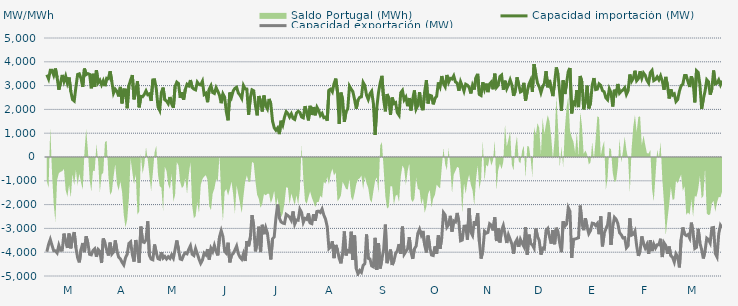
| Category | Capacidad importación (MW) | Capacidad exportación (MW) |
|---|---|---|
| 0 | 3457.333 | -3980.625 |
| 1900-01-01 | 3283.042 | -3676.875 |
| 1900-01-02 | 3641.25 | -3464.5 |
| 1900-01-03 | 3640.708 | -3708.75 |
| 1900-01-04 | 3435.708 | -3937.5 |
| 1900-01-05 | 3718.125 | -3943.125 |
| 1900-01-06 | 3344.458 | -4031.25 |
| 1900-01-07 | 2827.083 | -3710.625 |
| 1900-01-08 | 3113.75 | -3920.625 |
| 1900-01-09 | 3448.125 | -3913.125 |
| 1900-01-10 | 3172.083 | -3219.375 |
| 1900-01-11 | 3397.5 | -3562.5 |
| 1900-01-12 | 3101.042 | -3819.375 |
| 1900-01-13 | 3341.25 | -3215.625 |
| 1900-01-14 | 2760.833 | -3838.125 |
| 1900-01-15 | 2417.5 | -3395.625 |
| 1900-01-16 | 2354.583 | -3155.625 |
| 1900-01-17 | 2936.875 | -3811.875 |
| 1900-01-18 | 3468.75 | -4241.25 |
| 1900-01-19 | 3495 | -4426.875 |
| 1900-01-20 | 3297.083 | -3890.625 |
| 1900-01-21 | 2946.292 | -3613.125 |
| 1900-01-22 | 3714.792 | -3997.5 |
| 1900-01-23 | 3460.833 | -3331.875 |
| 1900-01-24 | 3502.917 | -3618.5 |
| 1900-01-25 | 3472.5 | -4089.375 |
| 1900-01-26 | 2885.87 | -4111.304 |
| 1900-01-27 | 3496.875 | -3930 |
| 1900-01-28 | 2942.5 | -3858.75 |
| 1900-01-29 | 3650.625 | -4194.375 |
| 1900-01-30 | 3122.458 | -3885 |
| 1900-01-31 | 3230.042 | -3961.875 |
| 1900-02-01 | 3034.208 | -4453.125 |
| 1900-02-02 | 3206.25 | -3423.75 |
| 1900-02-03 | 2977.5 | -3611.25 |
| 1900-02-04 | 3309.375 | -3911.25 |
| 1900-02-05 | 3288.75 | -4138.125 |
| 1900-02-06 | 3602.833 | -3596.25 |
| 1900-02-07 | 3174.375 | -4080 |
| 1900-02-08 | 2683.667 | -3991.875 |
| 1900-02-09 | 2848.875 | -3504.833 |
| 1900-02-10 | 2758.542 | -3938.333 |
| 1900-02-11 | 2545.417 | -4209.375 |
| 1900-02-12 | 2945.625 | -4278.75 |
| 1900-02-13 | 2252.5 | -4423.125 |
| 1900-02-14 | 2829.375 | -4533.75 |
| 1900-02-15 | 2820.917 | -4235.625 |
| 1900-02-16 | 2048.125 | -4081.208 |
| 1900-02-17 | 3003.75 | -3632.292 |
| 1900-02-18 | 3232.5 | -3565.625 |
| 1900-02-19 | 3440.625 | -4096.875 |
| 1900-02-20 | 2422.5 | -4393.125 |
| 1900-02-21 | 2763.958 | -3487.5 |
| 1900-02-22 | 3183.75 | -3943.125 |
| 1900-02-23 | 2087.083 | -4443.75 |
| 1900-02-24 | 2547 | -2925.75 |
| 1900-02-25 | 2531.667 | -3560.625 |
| 1900-02-26 | 2628.75 | -3590.625 |
| 1900-02-27 | 2778.75 | -3480 |
| 1900-02-28 | 2617.292 | -2701.792 |
| 1900-02-28 | 2655 | -4141.875 |
| 1900-03-01 | 2355.417 | -4288.125 |
| 1900-03-02 | 3240.75 | -4318.125 |
| 1900-03-03 | 3247.5 | -3676.875 |
| 1900-03-04 | 2878.042 | -4025.625 |
| 1900-03-05 | 2109.167 | -4269.375 |
| 1900-03-06 | 1961.042 | -4299.375 |
| 1900-03-07 | 2710.208 | -4003.125 |
| 1900-03-08 | 2916 | -4248.333 |
| 1900-03-09 | 2401.875 | -4179.375 |
| 1900-03-10 | 2351.25 | -4286.25 |
| 1900-03-11 | 2238.75 | -4192.5 |
| 1900-03-12 | 2520 | -4265.625 |
| 1900-03-13 | 2227.5 | -4108.125 |
| 1900-03-14 | 2070.583 | -4246.875 |
| 1900-03-15 | 2958.75 | -3892.5 |
| 1900-03-16 | 3146.25 | -3508.125 |
| 1900-03-17 | 3087.5 | -3877.5 |
| 1900-03-18 | 2487.5 | -4284.375 |
| 1900-03-19 | 2722.5 | -4310.625 |
| 1900-03-20 | 2411.25 | -4125 |
| 1900-03-21 | 2840.5 | -4025.625 |
| 1900-03-22 | 3054.5 | -4066.875 |
| 1900-03-23 | 2992.958 | -3879.375 |
| 1900-03-24 | 3232.5 | -3729.375 |
| 1900-03-25 | 2917.5 | -4085.625 |
| 1900-03-26 | 2853.75 | -4141.875 |
| 1900-03-27 | 2819.458 | -3849.375 |
| 1900-03-28 | 3145.042 | -4061.25 |
| 1900-03-29 | 3046.958 | -4290 |
| 1900-03-30 | 3028.125 | -4468.125 |
| 1900-03-31 | 3180.542 | -4331.25 |
| 1900-04-01 | 2624.958 | -4042.5 |
| 1900-04-02 | 2676.25 | -4115.625 |
| 1900-04-03 | 2302.5 | -3873.75 |
| 1900-04-04 | 2854.208 | -4308.75 |
| 1900-04-05 | 2997.833 | -3837.167 |
| 1900-04-06 | 2709.375 | -3973.125 |
| 1900-04-07 | 2670 | -3712.958 |
| 1900-04-08 | 2913.75 | -3958.125 |
| 1900-04-09 | 2765.625 | -4134.375 |
| 1900-04-10 | 2587.5 | -3352.5 |
| 1900-04-11 | 2261.25 | -3093.75 |
| 1900-04-12 | 2651.25 | -3345.208 |
| 1900-04-13 | 2510.625 | -3963.75 |
| 1900-04-14 | 1885.875 | -4044.375 |
| 1900-04-15 | 1541.5 | -3601.375 |
| 1900-04-16 | 2707.5 | -4426.875 |
| 1900-04-17 | 2516.25 | -4128.75 |
| 1900-04-18 | 2775 | -4059.375 |
| 1900-04-19 | 2883.75 | -3906.667 |
| 1900-04-20 | 2930.625 | -3742.5 |
| 1900-04-21 | 2685 | -4061.25 |
| 1900-04-22 | 2596.875 | -4213.125 |
| 1900-04-23 | 2463.75 | -4295.625 |
| 1900-04-24 | 3005.625 | -4065 |
| 1900-04-25 | 2861.25 | -4370.625 |
| 1900-04-26 | 2855.083 | -3533.583 |
| 1900-04-27 | 1775.625 | -3751.875 |
| 1900-04-28 | 2478.75 | -3391.875 |
| 1900-04-29 | 2821.875 | -2444.375 |
| 1900-04-30 | 2782.5 | -2903.75 |
| 1900-05-01 | 2169.375 | -3964.667 |
| 1900-05-02 | 1751.292 | -3614.625 |
| 1900-05-03 | 2561.25 | -2926.875 |
| 1900-05-04 | 2356.875 | -3995.625 |
| 1900-05-05 | 1911.125 | -2849.625 |
| 1900-05-06 | 2583.75 | -3240 |
| 1900-05-07 | 2157.125 | -2962.917 |
| 1900-05-08 | 2021.375 | -3195.625 |
| 1900-05-09 | 2439.375 | -3776.25 |
| 1900-05-10 | 2235 | -4305 |
| 1900-05-11 | 1509.375 | -3436.875 |
| 1900-05-12 | 1230.208 | -3360 |
| 1900-05-13 | 1123.125 | -2546.875 |
| 1900-05-14 | 1221.25 | -1995.875 |
| 1900-05-15 | 962.083 | -2563.125 |
| 1900-05-16 | 1523.958 | -2728.125 |
| 1900-05-17 | 1344.375 | -2776.875 |
| 1900-05-18 | 1676.25 | -2795.625 |
| 1900-05-19 | 1899.375 | -2411.25 |
| 1900-05-20 | 1826.25 | -2461.875 |
| 1900-05-21 | 1680 | -2529.375 |
| 1900-05-22 | 1815 | -2662.5 |
| 1900-05-23 | 1621.458 | -2287.5 |
| 1900-05-24 | 1577.083 | -2818.125 |
| 1900-05-25 | 1846.875 | -2643.75 |
| 1900-05-26 | 1923.75 | -2656.875 |
| 1900-05-27 | 1875 | -2195.625 |
| 1900-05-28 | 1683.75 | -2330.625 |
| 1900-05-29 | 1646.25 | -2746.875 |
| 1900-05-30 | 2137.5 | -2580.5 |
| 1900-05-31 | 1860 | -2620.625 |
| 1900-06-01 | 1537.5 | -2371.875 |
| 1900-06-02 | 2149.292 | -2771.25 |
| 1900-06-03 | 1766.25 | -2801.25 |
| 1900-06-04 | 2097.75 | -2405.625 |
| 1900-06-05 | 1753.125 | -2676.75 |
| 1900-06-06 | 2090.625 | -2285.292 |
| 1900-06-07 | 1956.125 | -2274.75 |
| 1900-06-08 | 1743.75 | -2330.125 |
| 1900-06-09 | 1833.75 | -2185.875 |
| 1900-06-10 | 1651.875 | -2439.375 |
| 1900-06-11 | 1677 | -2608.125 |
| 1900-06-12 | 1526.25 | -2926.875 |
| 1900-06-13 | 2806.875 | -3847.5 |
| 1900-06-14 | 2853.75 | -3770.625 |
| 1900-06-15 | 2739.375 | -3542.5 |
| 1900-06-16 | 3086.25 | -4248.75 |
| 1900-06-17 | 3294.375 | -3694.583 |
| 1900-06-18 | 2737.5 | -3914.167 |
| 1900-06-19 | 1388.958 | -4258.125 |
| 1900-06-20 | 2705.625 | -4468.125 |
| 1900-06-21 | 2414.25 | -4032.292 |
| 1900-06-22 | 1474.5 | -3127.5 |
| 1900-06-23 | 1904.833 | -4134.375 |
| 1900-06-24 | 2018.333 | -3933.75 |
| 1900-06-25 | 2978.625 | -3980.625 |
| 1900-06-26 | 2851.875 | -3137.917 |
| 1900-06-27 | 2745 | -4327.5 |
| 1900-06-28 | 2411.25 | -3294.375 |
| 1900-06-29 | 2032.5 | -4693.125 |
| 1900-06-30 | 2394.375 | -4916.25 |
| 1900-07-01 | 2506.875 | -4770 |
| 1900-07-02 | 2527.5 | -4845 |
| 1900-07-03 | 3132.875 | -4556.25 |
| 1900-07-04 | 3001.875 | -4479.375 |
| 1900-07-05 | 2597 | -3253.75 |
| 1900-07-06 | 2415.833 | -4258.125 |
| 1900-07-07 | 2655 | -4284.375 |
| 1900-07-08 | 2764.458 | -4576.875 |
| 1900-07-09 | 2248.625 | -4616.25 |
| 1900-07-10 | 931.875 | -3396.042 |
| 1900-07-11 | 2074.792 | -4740 |
| 1900-07-12 | 2707.5 | -3624.375 |
| 1900-07-13 | 3118.125 | -4681.875 |
| 1900-07-14 | 3408.75 | -4280.625 |
| 1900-07-15 | 2415 | -3889.583 |
| 1900-07-16 | 1918.917 | -2840.25 |
| 1900-07-17 | 2645.125 | -4460.625 |
| 1900-07-18 | 2469.792 | -4186.875 |
| 1900-07-19 | 1772.542 | -3887.917 |
| 1900-07-20 | 2498.667 | -4538.125 |
| 1900-07-21 | 2245.542 | -4370 |
| 1900-07-22 | 2285.625 | -4056.25 |
| 1900-07-23 | 1862.708 | -3941.667 |
| 1900-07-24 | 1755.417 | -3663.125 |
| 1900-07-25 | 2699.583 | -4063.125 |
| 1900-07-26 | 2797.5 | -2925.625 |
| 1900-07-27 | 2403.333 | -4085.625 |
| 1900-07-28 | 2516.25 | -3971.25 |
| 1900-07-29 | 2135.625 | -3854.792 |
| 1900-07-30 | 2477.125 | -3369.292 |
| 1900-07-31 | 1956.292 | -3999.375 |
| 1900-08-01 | 2427.5 | -4280 |
| 1900-08-02 | 2798 | -3856.875 |
| 1900-08-03 | 2018.125 | -3744.583 |
| 1900-08-04 | 2168.958 | -3208.75 |
| 1900-08-05 | 2728.125 | -3034.375 |
| 1900-08-06 | 2131.75 | -3278.125 |
| 1900-08-07 | 1966.875 | -3106.458 |
| 1900-08-08 | 2738.083 | -3703.375 |
| 1900-08-09 | 3229.167 | -4012.5 |
| 1900-08-10 | 2249.792 | -3300.833 |
| 1900-08-11 | 2592.917 | -3809.792 |
| 1900-08-12 | 2566.25 | -4116.667 |
| 1900-08-13 | 2212.5 | -4138.708 |
| 1900-08-14 | 2464.375 | -3755.833 |
| 1900-08-15 | 2551.042 | -4061.25 |
| 1900-08-16 | 3133.5 | -3295.833 |
| 1900-08-17 | 2953.75 | -3854.167 |
| 1900-08-18 | 3401.25 | -3375.917 |
| 1900-08-19 | 3082.5 | -2336.25 |
| 1900-08-20 | 2949.375 | -2439.375 |
| 1900-08-21 | 3446.25 | -2947.5 |
| 1900-08-22 | 3138.75 | -2840.625 |
| 1900-08-23 | 3305 | -2472.958 |
| 1900-08-24 | 3276.125 | -3134.625 |
| 1900-08-25 | 3410.625 | -2685.417 |
| 1900-08-26 | 3153.75 | -2727.292 |
| 1900-08-27 | 3110.625 | -2351.25 |
| 1900-08-28 | 2786.458 | -2737.5 |
| 1900-08-29 | 3159.375 | -3519.375 |
| 1900-08-30 | 2974.6 | -3488.4 |
| 1900-08-31 | 2766.667 | -2906.917 |
| 1900-09-01 | 3058.125 | -2902.5 |
| 1900-09-02 | 3018.75 | -3474.375 |
| 1900-09-03 | 2925.625 | -2158.375 |
| 1900-09-04 | 2670.667 | -3157.5 |
| 1900-09-05 | 3015 | -3296.25 |
| 1900-09-06 | 2835.25 | -2693.125 |
| 1900-09-07 | 3337.5 | -2882.083 |
| 1900-09-08 | 3493.125 | -2358.75 |
| 1900-09-09 | 2626.042 | -3555 |
| 1900-09-10 | 2583.542 | -4267.5 |
| 1900-09-11 | 3140.625 | -3948.75 |
| 1900-09-12 | 2844.375 | -3122.5 |
| 1900-09-13 | 3082.5 | -3200.625 |
| 1900-09-14 | 2726.25 | -3170.625 |
| 1900-09-15 | 3071.25 | -2806.875 |
| 1900-09-16 | 3151.875 | -2865 |
| 1900-09-17 | 2845.417 | -3084.375 |
| 1900-09-18 | 3500.625 | -2536.875 |
| 1900-09-19 | 2921.75 | -3531.625 |
| 1900-09-20 | 3012.625 | -2985.75 |
| 1900-09-21 | 3378.75 | -3590.625 |
| 1900-09-22 | 3442.5 | -3078.75 |
| 1900-09-23 | 2829.167 | -2881.042 |
| 1900-09-24 | 3205.833 | -3234.375 |
| 1900-09-25 | 2873.625 | -3613.125 |
| 1900-09-26 | 3038.333 | -3270 |
| 1900-09-27 | 3245.625 | -3459.375 |
| 1900-09-28 | 3029.167 | -3656.25 |
| 1900-09-29 | 2571.042 | -4057.5 |
| 1900-09-30 | 2766.125 | -3596.417 |
| 1900-10-01 | 3348.75 | -3465 |
| 1900-10-02 | 3046.333 | -3774.375 |
| 1900-10-03 | 2732.708 | -3460.042 |
| 1900-10-04 | 2770.75 | -3616.875 |
| 1900-10-05 | 3116.25 | -3757.75 |
| 1900-10-06 | 2370.5 | -2949.375 |
| 1900-10-07 | 2758.625 | -4102.5 |
| 1900-10-08 | 3054.167 | -3262.5 |
| 1900-10-09 | 3221.875 | -3637.5 |
| 1900-10-10 | 2734.792 | -3695.625 |
| 1900-10-11 | 3901.875 | -3830.625 |
| 1900-10-12 | 3478.125 | -3007.5 |
| 1900-10-13 | 3100.208 | -3343.125 |
| 1900-10-14 | 2951.458 | -3500.625 |
| 1900-10-15 | 2703.125 | -4100.625 |
| 1900-10-16 | 2949.667 | -3832.5 |
| 1900-10-17 | 3092.292 | -3864.375 |
| 1900-10-18 | 3609.375 | -3088.125 |
| 1900-10-19 | 2928.75 | -3003.75 |
| 1900-10-20 | 3238.333 | -3346.875 |
| 1900-10-21 | 2865.417 | -3639.375 |
| 1900-10-22 | 2557.917 | -3067.5 |
| 1900-10-23 | 3131.667 | -3665.625 |
| 1900-10-24 | 3761.25 | -2973.625 |
| 1900-10-25 | 3468.542 | -3153.75 |
| 1900-10-26 | 2673.75 | -3622.5 |
| 1900-10-27 | 1945.625 | -3999.375 |
| 1900-10-28 | 3222.083 | -2703.875 |
| 1900-10-29 | 2645.458 | -2900.625 |
| 1900-10-30 | 3097.5 | -2827.5 |
| 1900-10-31 | 3595.208 | -2128.75 |
| 1900-11-01 | 3741.458 | -2283.75 |
| 1900-11-02 | 1833.125 | -4242.5 |
| 1900-11-03 | 2294.25 | -3457.125 |
| 1900-11-04 | 2210.833 | -3444.375 |
| 1900-11-05 | 2808.75 | -3420 |
| 1900-11-06 | 2098.083 | -3391.875 |
| 1900-11-07 | 3404.792 | -2041.875 |
| 1900-11-08 | 3136.875 | -2790.292 |
| 1900-11-09 | 2001.25 | -3075.75 |
| 1900-11-10 | 2334.583 | -2570.625 |
| 1900-11-11 | 2998.542 | -2932.5 |
| 1900-11-12 | 2041.583 | -3219.375 |
| 1900-11-13 | 2261.875 | -3091.875 |
| 1900-11-14 | 3017.292 | -2780.625 |
| 1900-11-15 | 3316.667 | -2796 |
| 1900-11-16 | 2831.875 | -2880.375 |
| 1900-11-17 | 2848.875 | -2791.375 |
| 1900-11-18 | 3072.083 | -3242.5 |
| 1900-11-19 | 3008.75 | -2494.125 |
| 1900-11-20 | 2789.75 | -3753.75 |
| 1900-11-21 | 2740.75 | -3208.125 |
| 1900-11-22 | 2484.167 | -3015 |
| 1900-11-23 | 2405.083 | -2845.208 |
| 1900-11-24 | 2862.542 | -2330.625 |
| 1900-11-25 | 2704.875 | -3693.75 |
| 1900-11-26 | 2121.458 | -2932.25 |
| 1900-11-27 | 2826.875 | -2536.458 |
| 1900-11-28 | 2666.25 | -2617.875 |
| 1900-11-29 | 3068.375 | -2797.625 |
| 1900-11-30 | 2681.458 | -3181.875 |
| 1900-12-01 | 2762.167 | -3268.125 |
| 1900-12-02 | 2816.458 | -3403.125 |
| 1900-12-03 | 2908.75 | -3388.125 |
| 1900-12-04 | 2628.458 | -3817.5 |
| 1900-12-05 | 2784.5 | -3729.375 |
| 1900-12-06 | 3466.875 | -2575.375 |
| 1900-12-07 | 3180 | -3284.375 |
| 1900-12-08 | 3301.25 | -3251.25 |
| 1900-12-09 | 3624.375 | -3114.375 |
| 1900-12-10 | 3203.333 | -3733.125 |
| 1900-12-11 | 3288.125 | -4155 |
| 1900-12-12 | 3606.25 | -3943.125 |
| 1900-12-13 | 3313.75 | -3335.625 |
| 1900-12-14 | 3531.417 | -3646.875 |
| 1900-12-15 | 3433.125 | -3826.875 |
| 1900-12-16 | 3223.542 | -3673.333 |
| 1900-12-17 | 3103.75 | -4066.875 |
| 1900-12-18 | 3546.25 | -3496.875 |
| 1900-12-19 | 3638.5 | -3952.5 |
| 1900-12-20 | 3210 | -3661.875 |
| 1900-12-21 | 3255.417 | -3826.875 |
| 1900-12-22 | 3367.5 | -3690 |
| 1900-12-23 | 3244.5 | -3684.375 |
| 1900-12-24 | 3411.458 | -3435 |
| 1900-12-25 | 3192.708 | -4203.75 |
| 1900-12-26 | 2825 | -3605.625 |
| 1900-12-27 | 3365.667 | -3718.625 |
| 1900-12-28 | 3014.375 | -4063.125 |
| 1900-12-29 | 2458.292 | -3762 |
| 1900-12-30 | 2845.5 | -4151.25 |
| 1900-12-31 | 2597.292 | -4215 |
| 1901-01-01 | 2650.375 | -4415.625 |
| 1901-01-02 | 2331.042 | -4066.875 |
| 1901-01-03 | 2415.625 | -4185 |
| 1901-01-04 | 2763.875 | -4638.75 |
| 1901-01-05 | 2996.042 | -3465 |
| 1901-01-06 | 3054.375 | -2960.625 |
| 1901-01-07 | 3421.875 | -3238.875 |
| 1901-01-08 | 3422.25 | -3301.458 |
| 1901-01-09 | 3168.75 | -3257.708 |
| 1901-01-10 | 2940.75 | -3407.5 |
| 1901-01-11 | 3391.875 | -2758.75 |
| 1901-01-12 | 3159.375 | -3175.208 |
| 1901-01-13 | 2294.792 | -3843.75 |
| 1901-01-14 | 3620.625 | -3793.125 |
| 1901-01-15 | 3550.208 | -3016.875 |
| 1901-01-16 | 3036.458 | -3616.875 |
| 1901-01-17 | 2023.333 | -3886.25 |
| 1901-01-18 | 2440.208 | -4263.75 |
| 1901-01-19 | 2764.167 | -3943.125 |
| 1901-01-20 | 3245.625 | -3410.667 |
| 1901-01-21 | 3161.25 | -3470.625 |
| 1901-01-22 | 2621.458 | -3614.625 |
| 1901-01-23 | 2861.25 | -2975.958 |
| 1901-01-24 | 3635.217 | -2962.391 |
| 1901-01-25 | 3071.083 | -4052.75 |
| 1901-01-26 | 3103.625 | -4196.25 |
| 1901-01-27 | 3238.125 | -3235.75 |
| 1901-01-28 | 3031.875 | -2868.708 |
| 1901-01-29 | 3202.5 | -2981.292 |